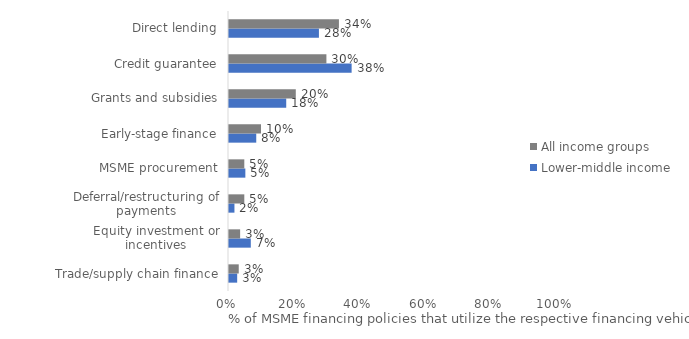
| Category | Lower-middle income | All income groups |
|---|---|---|
| Trade/supply chain finance | 0.025 | 0.03 |
| Equity investment or incentives | 0.067 | 0.034 |
| Deferral/restructuring of payments | 0.017 | 0.047 |
| MSME procurement | 0.05 | 0.047 |
| Early-stage finance | 0.083 | 0.098 |
| Grants and subsidies | 0.175 | 0.204 |
| Credit guarantee | 0.375 | 0.298 |
| Direct lending | 0.275 | 0.336 |